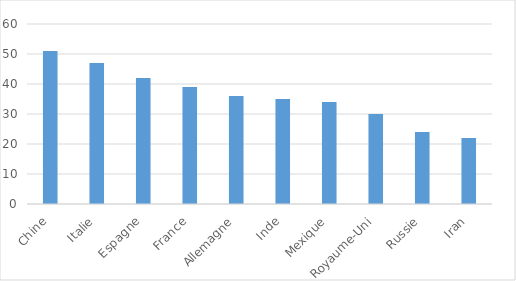
| Category | Nombre de bien inscrits |
|---|---|
| Chine | 51 |
| Italie | 47 |
| Espagne | 42 |
| France | 39 |
| Allemagne | 36 |
| Inde | 35 |
| Mexique | 34 |
| Royaume-Uni | 30 |
| Russie | 24 |
| Iran | 22 |